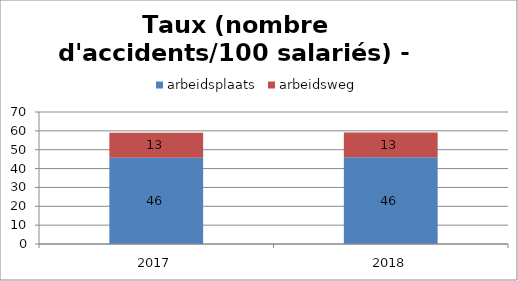
| Category | arbeidsplaats | arbeidsweg |
|---|---|---|
| 2017.0 | 45.772 | 13.173 |
| 2018.0 | 45.987 | 13.092 |